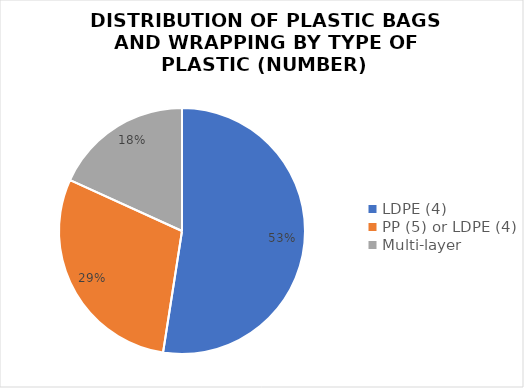
| Category | Series 0 |
|---|---|
| LDPE (4) | 3037 |
| PP (5) or LDPE (4) | 1698 |
| Multi-layer | 1054 |